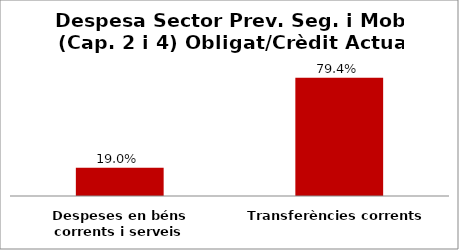
| Category | Series 0 |
|---|---|
| Despeses en béns corrents i serveis | 0.19 |
| Transferències corrents | 0.794 |